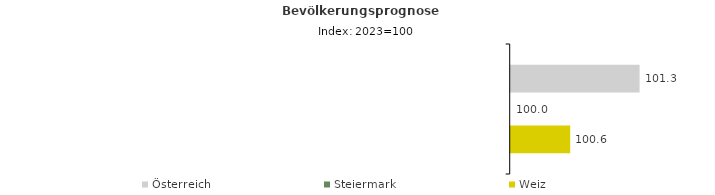
| Category | Österreich | Steiermark | Weiz |
|---|---|---|---|
| 2023.0 | 101.3 | 100 | 100.6 |